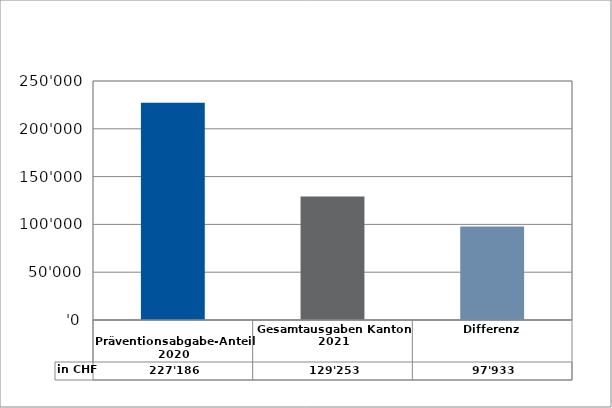
| Category | in CHF |
|---|---|
| 
Präventionsabgabe-Anteil 2020

 | 227185.9 |
| Gesamtausgaben Kanton 2021
 | 129252.65 |
| Differenz | 97933.25 |